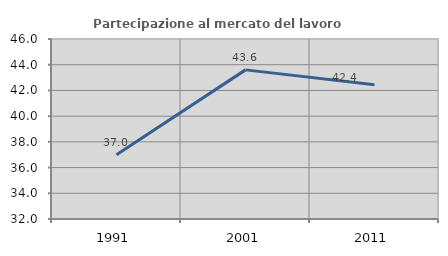
| Category | Partecipazione al mercato del lavoro  femminile |
|---|---|
| 1991.0 | 36.991 |
| 2001.0 | 43.599 |
| 2011.0 | 42.435 |